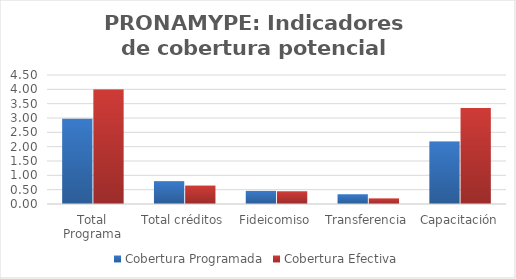
| Category | Cobertura Programada | Cobertura Efectiva |
|---|---|---|
| Total Programa | 2.977 | 3.99 |
| Total créditos | 0.797 | 0.641 |
| Fideicomiso | 0.457 | 0.444 |
| Transferencia | 0.34 | 0.197 |
| Capacitación | 2.18 | 3.349 |